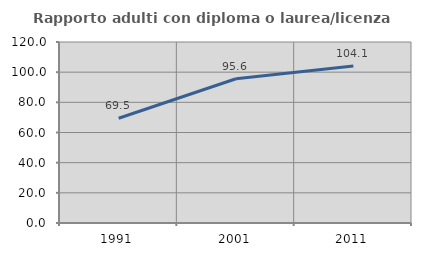
| Category | Rapporto adulti con diploma o laurea/licenza media  |
|---|---|
| 1991.0 | 69.478 |
| 2001.0 | 95.62 |
| 2011.0 | 104.101 |